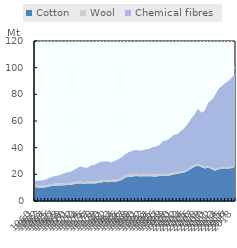
| Category | Cotton | Wool | Chemical fibres |
|---|---|---|---|
| 1960.0 | 10.356 | 1.495 | 3.302 |
| 1961.0 | 10.085 | 1.505 | 3.512 |
| 1962.0 | 9.902 | 1.501 | 3.936 |
| 1963.0 | 10.147 | 1.475 | 4.381 |
| 1964.0 | 10.83 | 1.46 | 4.966 |
| 1965.0 | 11.318 | 1.473 | 5.391 |
| 1966.0 | 11.539 | 1.545 | 5.712 |
| 1967.0 | 11.695 | 1.473 | 6.044 |
| 1968.0 | 11.763 | 1.565 | 7.106 |
| 1969.0 | 11.911 | 1.604 | 7.733 |
| 1970.0 | 12.105 | 1.5 | 8.136 |
| 1971.0 | 12.493 | 1.48 | 9.064 |
| 1972.0 | 12.903 | 1.578 | 9.936 |
| 1973.0 | 13.288 | 1.443 | 11.3 |
| 1974.0 | 12.986 | 1.262 | 11.019 |
| 1975.0 | 13.047 | 1.358 | 10.312 |
| 1976.0 | 13.211 | 1.515 | 11.811 |
| 1977.0 | 13.117 | 1.478 | 12.43 |
| 1978.0 | 13.415 | 1.481 | 13.35 |
| 1979.0 | 13.897 | 1.558 | 13.985 |
| 1980.0 | 14.295 | 1.567 | 13.718 |
| 1981.0 | 14.124 | 1.576 | 14.031 |
| 1982.0 | 14.248 | 1.556 | 13.091 |
| 1983.0 | 14.547 | 1.612 | 14.006 |
| 1984.0 | 14.829 | 1.621 | 14.8 |
| 1985.0 | 15.767 | 1.625 | 15.42 |
| 1986.0 | 17.461 | 1.708 | 15.786 |
| 1987.0 | 18.225 | 1.754 | 16.566 |
| 1988.0 | 18.207 | 1.904 | 17.313 |
| 1989.0 | 18.695 | 1.861 | 17.69 |
| 1990.0 | 18.598 | 1.628 | 17.652 |
| 1991.0 | 18.547 | 1.801 | 17.706 |
| 1992.0 | 18.589 | 1.757 | 18.488 |
| 1993.0 | 18.538 | 1.649 | 18.916 |
| 1994.0 | 18.434 | 1.723 | 20.242 |
| 1995.0 | 18.401 | 1.554 | 20.813 |
| 1996.0 | 18.779 | 1.44 | 22.035 |
| 1997.0 | 18.98 | 1.361 | 24.666 |
| 1998.0 | 18.729 | 1.293 | 25.481 |
| 1999.0 | 19.222 | 1.393 | 26.56 |
| 2000.0 | 19.895 | 1.38 | 28.434 |
| 2001.0 | 20.379 | 1.361 | 28.326 |
| 2002.0 | 20.882 | 1.268 | 30.143 |
| 2003.0 | 21.359 | 1.227 | 31.727 |
| 2004.0 | 22.38 | 1.221 | 33.925 |
| 2005.0 | 24.196 | 1.218 | 36.112 |
| 2006.0 | 25.668 | 1.234 | 37.877 |
| 2007.0 | 26.623 | 1.221 | 41.354 |
| 2008.0 | 25.456 | 1.198 | 39.594 |
| 2009.0 | 24.396 | 1.106 | 42.243 |
| 2010.0 | 25.097 | 1.123 | 47.669 |
| 2011.0 | 23.798 | 1.122 | 50.974 |
| 2012.0 | 22.831 | 1.129 | 55.656 |
| 2013.0 | 23.721 | 1.157 | 59.402 |
| 2014.0 | 24.304 | 1.155 | 60.854 |
| 2015.0 | 24.4 | 1.16 | 63.158 |
| 2016.0 | 24.296 | 1.157 | 64.941 |
| 2017.0 | 24.878 | 1.172 | 67.067 |
| 2018.0 | 26.053 | 1.183 | 69.422 |